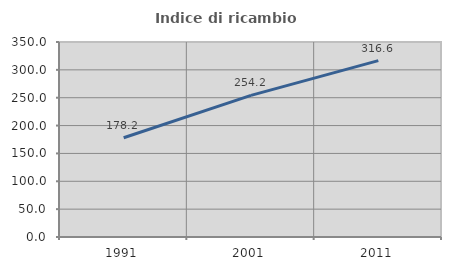
| Category | Indice di ricambio occupazionale  |
|---|---|
| 1991.0 | 178.185 |
| 2001.0 | 254.227 |
| 2011.0 | 316.562 |